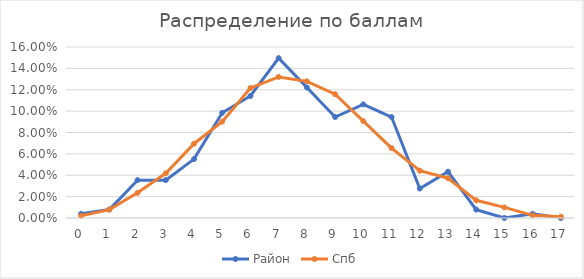
| Category | Район | Спб |
|---|---|---|
| 0.0 | 0.004 | 0.002 |
| 1.0 | 0.008 | 0.008 |
| 2.0 | 0.035 | 0.024 |
| 3.0 | 0.035 | 0.042 |
| 4.0 | 0.055 | 0.07 |
| 5.0 | 0.098 | 0.09 |
| 6.0 | 0.114 | 0.122 |
| 7.0 | 0.15 | 0.132 |
| 8.0 | 0.122 | 0.128 |
| 9.0 | 0.094 | 0.116 |
| 10.0 | 0.106 | 0.091 |
| 11.0 | 0.094 | 0.065 |
| 12.0 | 0.028 | 0.044 |
| 13.0 | 0.043 | 0.037 |
| 14.0 | 0.008 | 0.017 |
| 15.0 | 0 | 0.01 |
| 16.0 | 0.004 | 0.002 |
| 17.0 | 0 | 0.001 |